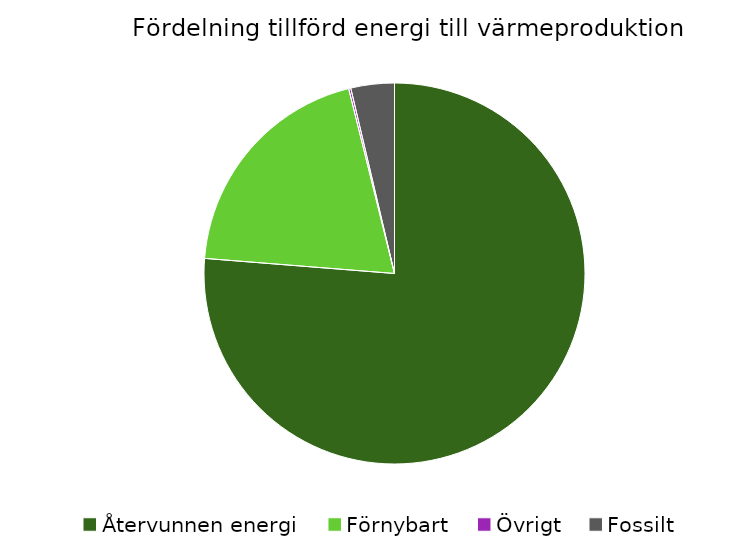
| Category | Fördelning värmeproduktion |
|---|---|
| Återvunnen energi | 0.763 |
| Förnybart | 0.199 |
| Övrigt | 0.002 |
| Fossilt | 0.037 |